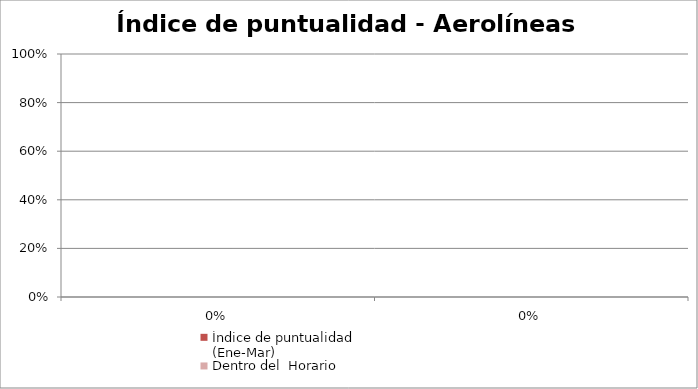
| Category | Índice de puntualidad
(Ene-Mar) | Dentro del  Horario |
|---|---|---|
| 0.0 | 0 | 0 |
| 0.0 | 0 | 0 |